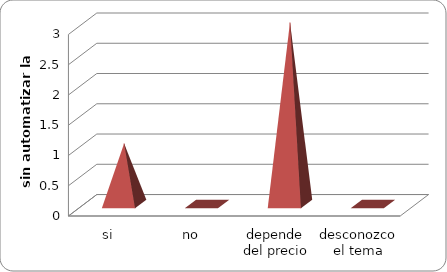
| Category | Series 0 |
|---|---|
| si | 1 |
| no | 0 |
| depende del precio | 3 |
| desconozco el tema | 0 |